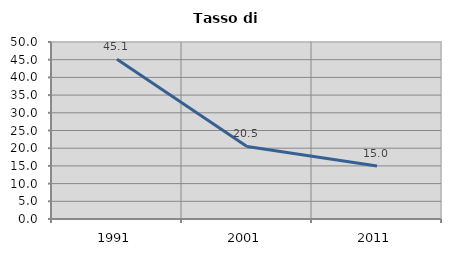
| Category | Tasso di disoccupazione   |
|---|---|
| 1991.0 | 45.118 |
| 2001.0 | 20.489 |
| 2011.0 | 14.953 |